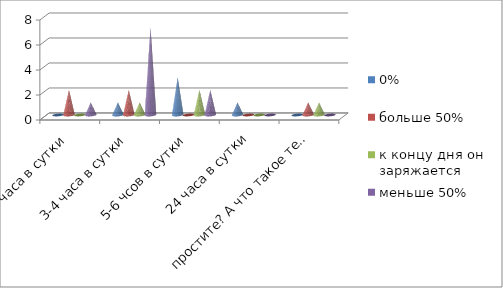
| Category | 0% | больше 50% | к концу дня он заряжается | меньше 50% |
|---|---|---|---|---|
| 1-2 часа в сутки | 0 | 2 | 0 | 1 |
| 3-4 часа в сутки | 1 | 2 | 1 | 7 |
| 5-6 чсов в сутки | 3 | 0 | 2 | 2 |
| 24 часа в сутки | 1 | 0 | 0 | 0 |
| простите? А что такое телефон? | 0 | 1 | 1 | 0 |